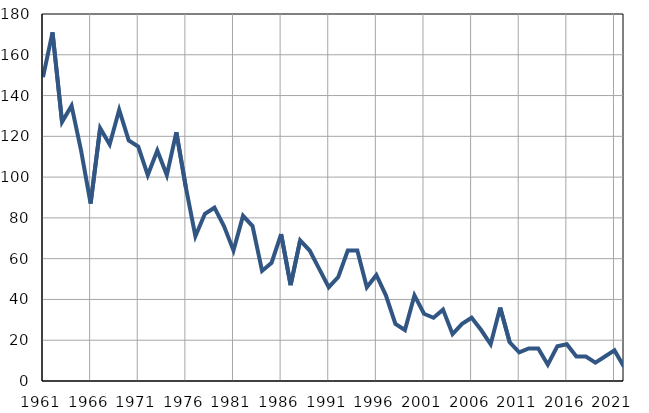
| Category | Infants
deaths |
|---|---|
| 1961.0 | 149 |
| 1962.0 | 171 |
| 1963.0 | 127 |
| 1964.0 | 135 |
| 1965.0 | 113 |
| 1966.0 | 87 |
| 1967.0 | 124 |
| 1968.0 | 116 |
| 1969.0 | 133 |
| 1970.0 | 118 |
| 1971.0 | 115 |
| 1972.0 | 101 |
| 1973.0 | 113 |
| 1974.0 | 101 |
| 1975.0 | 122 |
| 1976.0 | 95 |
| 1977.0 | 71 |
| 1978.0 | 82 |
| 1979.0 | 85 |
| 1980.0 | 76 |
| 1981.0 | 64 |
| 1982.0 | 81 |
| 1983.0 | 76 |
| 1984.0 | 54 |
| 1985.0 | 58 |
| 1986.0 | 72 |
| 1987.0 | 47 |
| 1988.0 | 69 |
| 1989.0 | 64 |
| 1990.0 | 55 |
| 1991.0 | 46 |
| 1992.0 | 51 |
| 1993.0 | 64 |
| 1994.0 | 64 |
| 1995.0 | 46 |
| 1996.0 | 52 |
| 1997.0 | 42 |
| 1998.0 | 28 |
| 1999.0 | 25 |
| 2000.0 | 42 |
| 2001.0 | 33 |
| 2002.0 | 31 |
| 2003.0 | 35 |
| 2004.0 | 23 |
| 2005.0 | 28 |
| 2006.0 | 31 |
| 2007.0 | 25 |
| 2008.0 | 18 |
| 2009.0 | 36 |
| 2010.0 | 19 |
| 2011.0 | 14 |
| 2012.0 | 16 |
| 2013.0 | 16 |
| 2014.0 | 8 |
| 2015.0 | 17 |
| 2016.0 | 18 |
| 2017.0 | 12 |
| 2018.0 | 12 |
| 2019.0 | 9 |
| 2020.0 | 12 |
| 2021.0 | 15 |
| 2022.0 | 7 |